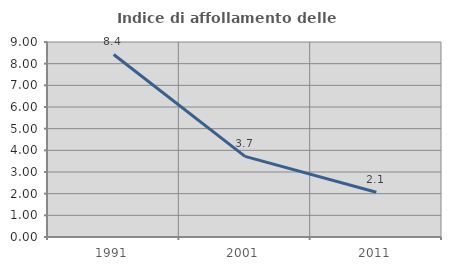
| Category | Indice di affollamento delle abitazioni  |
|---|---|
| 1991.0 | 8.424 |
| 2001.0 | 3.72 |
| 2011.0 | 2.065 |